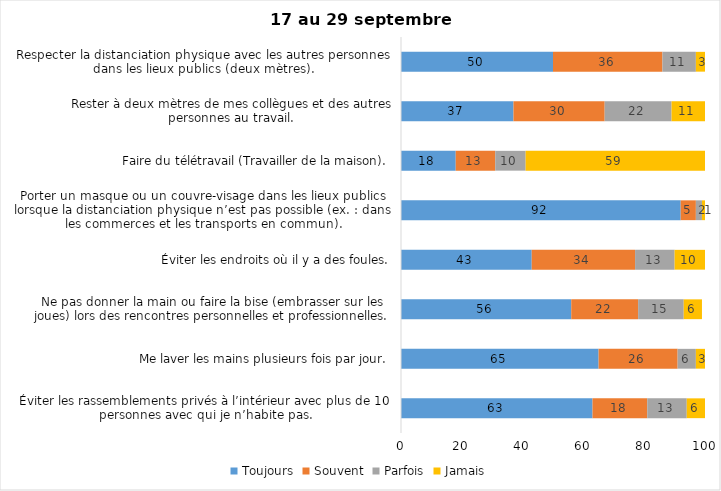
| Category | Toujours | Souvent | Parfois | Jamais |
|---|---|---|---|---|
| Éviter les rassemblements privés à l’intérieur avec plus de 10 personnes avec qui je n’habite pas. | 63 | 18 | 13 | 6 |
| Me laver les mains plusieurs fois par jour. | 65 | 26 | 6 | 3 |
| Ne pas donner la main ou faire la bise (embrasser sur les joues) lors des rencontres personnelles et professionnelles. | 56 | 22 | 15 | 6 |
| Éviter les endroits où il y a des foules. | 43 | 34 | 13 | 10 |
| Porter un masque ou un couvre-visage dans les lieux publics lorsque la distanciation physique n’est pas possible (ex. : dans les commerces et les transports en commun). | 92 | 5 | 2 | 1 |
| Faire du télétravail (Travailler de la maison). | 18 | 13 | 10 | 59 |
| Rester à deux mètres de mes collègues et des autres personnes au travail. | 37 | 30 | 22 | 11 |
| Respecter la distanciation physique avec les autres personnes dans les lieux publics (deux mètres). | 50 | 36 | 11 | 3 |